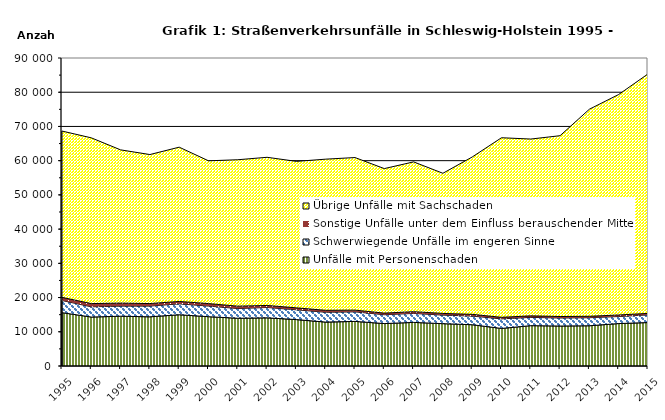
| Category | Unfälle mit Personenschaden | Schwerwiegende Unfälle im engeren Sinne | Sonstige Unfälle unter dem Einfluss berauschender Mittel 1) | Übrige Unfälle mit Sachschaden |
|---|---|---|---|---|
| 1995.0 | 15592 | 3544 | 920 | 48598 |
| 1996.0 | 14307 | 2996 | 937 | 48426 |
| 1997.0 | 14549 | 2947 | 883 | 44777 |
| 1998.0 | 14376 | 3136 | 737 | 43539 |
| 1999.0 | 14979 | 3185 | 696 | 45079 |
| 2000.0 | 14406 | 3105 | 725 | 41724 |
| 2001.0 | 13950 | 2845 | 688 | 42788 |
| 2002.0 | 14072 | 3028 | 595 | 43289 |
| 2003.0 | 13561 | 2866 | 559 | 42806 |
| 2004.0 | 12827 | 2877 | 564 | 44173 |
| 2005.0 | 13033 | 2795 | 499 | 44581 |
| 2006.0 | 12400 | 2588 | 466 | 42228 |
| 2007.0 | 12740 | 2628 | 507 | 43770 |
| 2008.0 | 12369 | 2510 | 481 | 40954 |
| 2009.0 | 12061 | 2528 | 502 | 45976 |
| 2010.0 | 10974 | 2803 | 441 | 52481 |
| 2011.0 | 11793 | 2419 | 443 | 51662 |
| 2012.0 | 11682 | 2353 | 422 | 52839 |
| 2013.0 | 11757 | 2357 | 414 | 60506 |
| 2014.0 | 12404 | 2056 | 448 | 64425 |
| 2015.0 | 12695 | 2249 | 427 | 69975 |